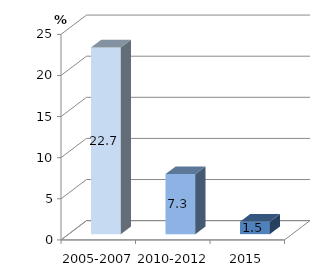
| Category | % de femmes infectées |
|---|---|
| 2005-2007 | 22.7 |
| 2010-2012 | 7.3 |
| 2015 | 1.5 |